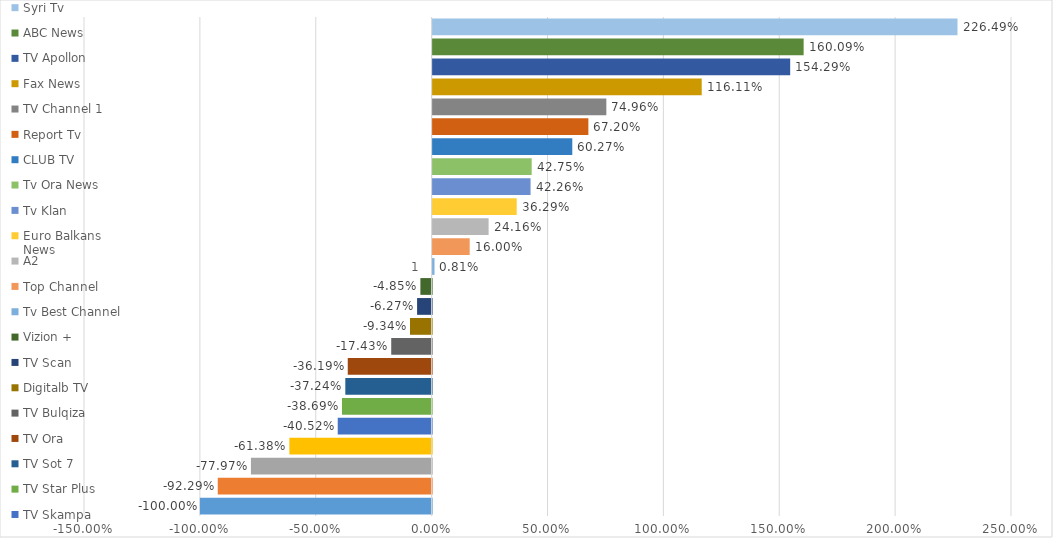
| Category | TVT | Shijak Tv | ADTN | TV UTV Education | TV Skampa | TV Star Plus | TV Sot 7 | TV Ora | TV Bulqiza | Digitalb TV | TV Scan | Vizion + | Tv Best Channel | Top Channel | A2 | Euro Balkans News | Tv Klan  | Tv Ora News | CLUB TV | Report Tv | TV Channel 1 | Fax News | TV Apollon | ABC News | Syri Tv |
|---|---|---|---|---|---|---|---|---|---|---|---|---|---|---|---|---|---|---|---|---|---|---|---|---|---|
| 0 | -1 | -0.923 | -0.78 | -0.614 | -0.405 | -0.387 | -0.372 | -0.362 | -0.174 | -0.093 | -0.063 | -0.049 | 0.008 | 0.16 | 0.242 | 0.363 | 0.423 | 0.427 | 0.603 | 0.672 | 0.75 | 1.161 | 1.543 | 1.601 | 2.265 |